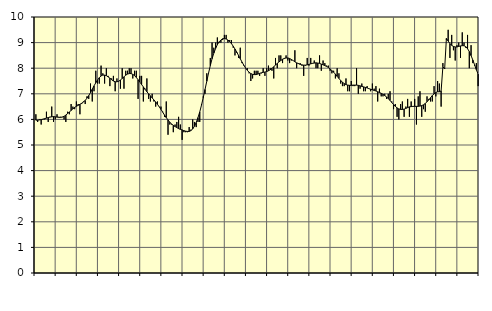
| Category | Piggar | Series 1 |
|---|---|---|
| nan | 6.2 | 5.97 |
| 1.0 | 5.9 | 5.97 |
| 1.0 | 6 | 5.98 |
| 1.0 | 5.8 | 5.99 |
| 1.0 | 6 | 6.01 |
| 1.0 | 6 | 6.03 |
| 1.0 | 6.3 | 6.05 |
| 1.0 | 5.9 | 6.07 |
| 1.0 | 6.1 | 6.09 |
| 1.0 | 6.5 | 6.1 |
| 1.0 | 5.9 | 6.11 |
| 1.0 | 6 | 6.1 |
| nan | 6.2 | 6.09 |
| 2.0 | 6.1 | 6.08 |
| 2.0 | 6.1 | 6.08 |
| 2.0 | 6.1 | 6.09 |
| 2.0 | 6 | 6.12 |
| 2.0 | 5.9 | 6.17 |
| 2.0 | 6.3 | 6.23 |
| 2.0 | 6.2 | 6.29 |
| 2.0 | 6.6 | 6.35 |
| 2.0 | 6.5 | 6.41 |
| 2.0 | 6.4 | 6.47 |
| 2.0 | 6.7 | 6.51 |
| nan | 6.6 | 6.55 |
| 3.0 | 6.2 | 6.59 |
| 3.0 | 6.6 | 6.63 |
| 3.0 | 6.7 | 6.68 |
| 3.0 | 6.6 | 6.74 |
| 3.0 | 6.9 | 6.83 |
| 3.0 | 6.8 | 6.93 |
| 3.0 | 7.4 | 7.05 |
| 3.0 | 6.7 | 7.18 |
| 3.0 | 7.1 | 7.31 |
| 3.0 | 7.9 | 7.43 |
| 3.0 | 7.4 | 7.54 |
| nan | 7.4 | 7.63 |
| 4.0 | 8.1 | 7.7 |
| 4.0 | 7.8 | 7.73 |
| 4.0 | 7.4 | 7.73 |
| 4.0 | 8 | 7.71 |
| 4.0 | 7.7 | 7.66 |
| 4.0 | 7.3 | 7.61 |
| 4.0 | 7.6 | 7.55 |
| 4.0 | 7.7 | 7.5 |
| 4.0 | 7.1 | 7.47 |
| 4.0 | 7.6 | 7.47 |
| 4.0 | 7.5 | 7.49 |
| nan | 7.2 | 7.54 |
| 5.0 | 8 | 7.6 |
| 5.0 | 7.2 | 7.66 |
| 5.0 | 7.9 | 7.73 |
| 5.0 | 7.9 | 7.77 |
| 5.0 | 8 | 7.79 |
| 5.0 | 8 | 7.79 |
| 5.0 | 7.6 | 7.76 |
| 5.0 | 7.9 | 7.71 |
| 5.0 | 7.9 | 7.64 |
| 5.0 | 6.8 | 7.55 |
| 5.0 | 7.7 | 7.46 |
| nan | 7.7 | 7.36 |
| 6.0 | 6.7 | 7.27 |
| 6.0 | 7.2 | 7.17 |
| 6.0 | 7.6 | 7.08 |
| 6.0 | 6.8 | 7 |
| 6.0 | 6.7 | 6.92 |
| 6.0 | 7 | 6.84 |
| 6.0 | 6.7 | 6.76 |
| 6.0 | 6.5 | 6.68 |
| 6.0 | 6.7 | 6.59 |
| 6.0 | 6.5 | 6.49 |
| 6.0 | 6.5 | 6.39 |
| nan | 6.3 | 6.28 |
| 7.0 | 6.1 | 6.17 |
| 7.0 | 6.7 | 6.07 |
| 7.0 | 5.4 | 5.98 |
| 7.0 | 5.8 | 5.89 |
| 7.0 | 5.8 | 5.82 |
| 7.0 | 5.5 | 5.77 |
| 7.0 | 5.8 | 5.72 |
| 7.0 | 5.9 | 5.68 |
| 7.0 | 6.1 | 5.64 |
| 7.0 | 5.8 | 5.61 |
| 7.0 | 5.2 | 5.59 |
| nan | 5.5 | 5.56 |
| 8.0 | 5.5 | 5.54 |
| 8.0 | 5.5 | 5.53 |
| 8.0 | 5.7 | 5.53 |
| 8.0 | 5.6 | 5.56 |
| 8.0 | 6 | 5.63 |
| 8.0 | 5.9 | 5.73 |
| 8.0 | 5.7 | 5.88 |
| 8.0 | 5.9 | 6.07 |
| 8.0 | 5.9 | 6.29 |
| 8.0 | 6.6 | 6.56 |
| 8.0 | 6.9 | 6.85 |
| nan | 7 | 7.17 |
| 9.0 | 7.8 | 7.49 |
| 9.0 | 7.8 | 7.81 |
| 9.0 | 8.4 | 8.1 |
| 9.0 | 9 | 8.37 |
| 9.0 | 8.8 | 8.59 |
| 9.0 | 9 | 8.77 |
| 9.0 | 9.2 | 8.92 |
| 9.0 | 9 | 9.03 |
| 9.0 | 9 | 9.1 |
| 9.0 | 9.1 | 9.15 |
| 9.0 | 9.3 | 9.16 |
| nan | 9.3 | 9.14 |
| 10.0 | 9 | 9.1 |
| 10.0 | 9.1 | 9.04 |
| 10.0 | 9.1 | 8.96 |
| 10.0 | 8.8 | 8.86 |
| 10.0 | 8.5 | 8.75 |
| 10.0 | 8.6 | 8.63 |
| 10.0 | 8.4 | 8.5 |
| 10.0 | 8.8 | 8.37 |
| 10.0 | 8.2 | 8.24 |
| 10.0 | 8.1 | 8.12 |
| 10.0 | 8 | 8.01 |
| nan | 8 | 7.92 |
| 11.0 | 7.8 | 7.84 |
| 11.0 | 7.5 | 7.79 |
| 11.0 | 7.6 | 7.76 |
| 11.0 | 7.9 | 7.75 |
| 11.0 | 7.9 | 7.75 |
| 11.0 | 7.9 | 7.77 |
| 11.0 | 7.7 | 7.8 |
| 11.0 | 7.8 | 7.82 |
| 11.0 | 8 | 7.84 |
| 11.0 | 7.7 | 7.85 |
| 11.0 | 8 | 7.87 |
| nan | 8.1 | 7.9 |
| 12.0 | 8 | 7.94 |
| 12.0 | 7.9 | 7.99 |
| 12.0 | 7.6 | 8.06 |
| 12.0 | 8.4 | 8.12 |
| 12.0 | 8 | 8.19 |
| 12.0 | 8.5 | 8.25 |
| 12.0 | 8.5 | 8.3 |
| 12.0 | 8.2 | 8.35 |
| 12.0 | 8.4 | 8.38 |
| 12.0 | 8.5 | 8.4 |
| 12.0 | 8.3 | 8.4 |
| nan | 8.2 | 8.38 |
| 13.0 | 8.3 | 8.34 |
| 13.0 | 8.3 | 8.3 |
| 13.0 | 8.7 | 8.25 |
| 13.0 | 8 | 8.21 |
| 13.0 | 8.2 | 8.18 |
| 13.0 | 8.2 | 8.15 |
| 13.0 | 8.1 | 8.13 |
| 13.0 | 7.7 | 8.12 |
| 13.0 | 8.1 | 8.12 |
| 13.0 | 8.4 | 8.13 |
| 13.0 | 8.1 | 8.15 |
| nan | 8.4 | 8.17 |
| 14.0 | 8.2 | 8.19 |
| 14.0 | 8.3 | 8.2 |
| 14.0 | 8 | 8.21 |
| 14.0 | 8 | 8.2 |
| 14.0 | 8.5 | 8.19 |
| 14.0 | 7.9 | 8.16 |
| 14.0 | 8.3 | 8.13 |
| 14.0 | 8.2 | 8.1 |
| 14.0 | 8.1 | 8.07 |
| 14.0 | 8.1 | 8.03 |
| 14.0 | 7.9 | 7.97 |
| nan | 7.8 | 7.91 |
| 15.0 | 7.9 | 7.84 |
| 15.0 | 7.6 | 7.77 |
| 15.0 | 8 | 7.68 |
| 15.0 | 7.8 | 7.6 |
| 15.0 | 7.4 | 7.52 |
| 15.0 | 7.3 | 7.45 |
| 15.0 | 7.3 | 7.4 |
| 15.0 | 7.6 | 7.36 |
| 15.0 | 7.1 | 7.34 |
| 15.0 | 7.1 | 7.33 |
| 15.0 | 7.5 | 7.33 |
| nan | 7.3 | 7.34 |
| 16.0 | 7.3 | 7.34 |
| 16.0 | 8 | 7.34 |
| 16.0 | 7 | 7.33 |
| 16.0 | 7.2 | 7.31 |
| 16.0 | 7.4 | 7.29 |
| 16.0 | 7.1 | 7.27 |
| 16.0 | 7.1 | 7.25 |
| 16.0 | 7.3 | 7.23 |
| 16.0 | 7.2 | 7.2 |
| 16.0 | 7.1 | 7.18 |
| 16.0 | 7.4 | 7.16 |
| nan | 7.2 | 7.13 |
| 17.0 | 7.3 | 7.11 |
| 17.0 | 6.7 | 7.08 |
| 17.0 | 7.2 | 7.05 |
| 17.0 | 6.9 | 7.02 |
| 17.0 | 6.9 | 6.98 |
| 17.0 | 7 | 6.93 |
| 17.0 | 6.8 | 6.88 |
| 17.0 | 7 | 6.81 |
| 17.0 | 7.1 | 6.74 |
| 17.0 | 6.7 | 6.66 |
| 17.0 | 6.4 | 6.58 |
| nan | 6.6 | 6.51 |
| 18.0 | 6.1 | 6.45 |
| 18.0 | 6 | 6.41 |
| 18.0 | 6.6 | 6.39 |
| 18.0 | 6.7 | 6.39 |
| 18.0 | 6.1 | 6.4 |
| 18.0 | 6.5 | 6.43 |
| 18.0 | 6.8 | 6.46 |
| 18.0 | 6.1 | 6.49 |
| 18.0 | 6.7 | 6.5 |
| 18.0 | 6.5 | 6.51 |
| 18.0 | 6.8 | 6.51 |
| nan | 5.8 | 6.51 |
| 19.0 | 6.9 | 6.51 |
| 19.0 | 7.1 | 6.52 |
| 19.0 | 6.1 | 6.54 |
| 19.0 | 6.4 | 6.57 |
| 19.0 | 6.3 | 6.62 |
| 19.0 | 6.9 | 6.69 |
| 19.0 | 6.8 | 6.76 |
| 19.0 | 6.7 | 6.85 |
| 19.0 | 6.7 | 6.93 |
| 19.0 | 7.3 | 7 |
| 19.0 | 6.9 | 7.05 |
| nan | 7.5 | 7.08 |
| 20.0 | 7.4 | 7.08 |
| 20.0 | 6.5 | 7.11 |
| 20.0 | 8.2 | 8.06 |
| 20.0 | 8 | 7.97 |
| 20.0 | 9.1 | 9.16 |
| 20.0 | 9.5 | 9.06 |
| 20.0 | 8.4 | 8.96 |
| 20.0 | 9.3 | 8.89 |
| 20.0 | 8.7 | 8.85 |
| 20.0 | 8.3 | 8.83 |
| 20.0 | 8.9 | 8.83 |
| nan | 9 | 8.85 |
| 21.0 | 8.4 | 8.87 |
| 21.0 | 9.4 | 8.88 |
| 21.0 | 9 | 8.88 |
| 21.0 | 8.8 | 8.84 |
| 21.0 | 9.3 | 8.76 |
| 21.0 | 8 | 8.65 |
| 21.0 | 8.9 | 8.49 |
| 21.0 | 8.2 | 8.32 |
| 21.0 | 8.1 | 8.13 |
| 21.0 | 8.2 | 7.94 |
| 21.0 | 7.3 | 7.77 |